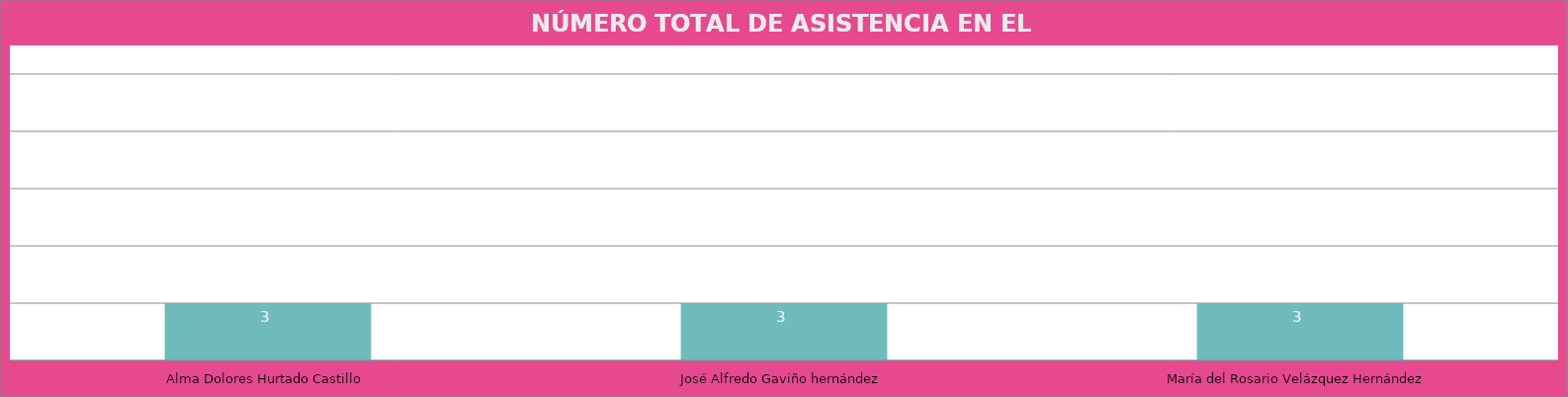
| Category | Alma Dolores Hurtado Castillo |
|---|---|
| Alma Dolores Hurtado Castillo | 3 |
| José Alfredo Gaviño hernández | 3 |
| María del Rosario Velázquez Hernández | 3 |